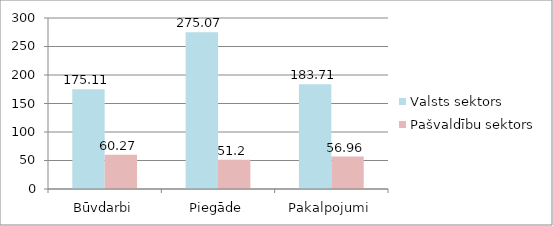
| Category | Valsts sektors | Pašvaldību sektors |
|---|---|---|
| Būvdarbi | 175.11 | 60.27 |
| Piegāde | 275.07 | 51.2 |
| Pakalpojumi | 183.71 | 56.96 |